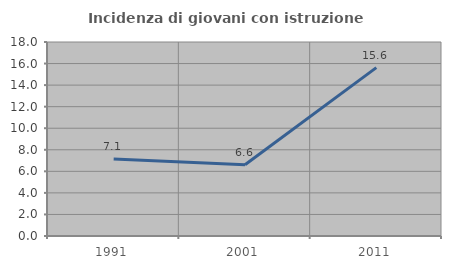
| Category | Incidenza di giovani con istruzione universitaria |
|---|---|
| 1991.0 | 7.143 |
| 2001.0 | 6.612 |
| 2011.0 | 15.625 |